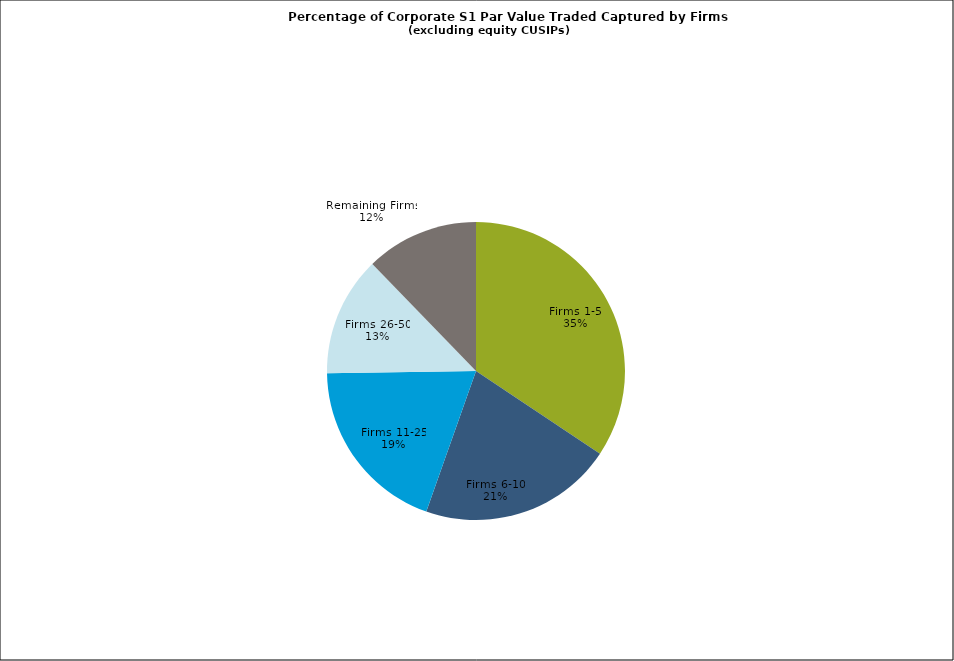
| Category | Series 0 |
|---|---|
| Firms 1-5 | 0.344 |
| Firms 6-10 | 0.211 |
| Firms 11-25 | 0.193 |
| Firms 26-50 | 0.13 |
| Remaining Firms | 0.122 |